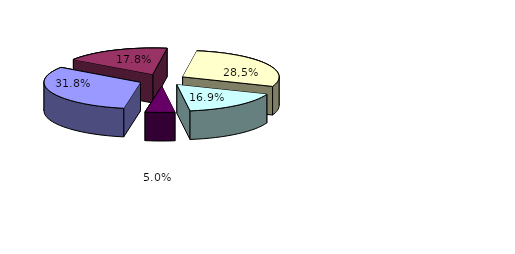
| Category | Series 0 |
|---|---|
| history museums | 77 |
| memorial museums | 43 |
| ethnography museums    | 69 |
| art  museums  | 41 |
| other museums | 12 |